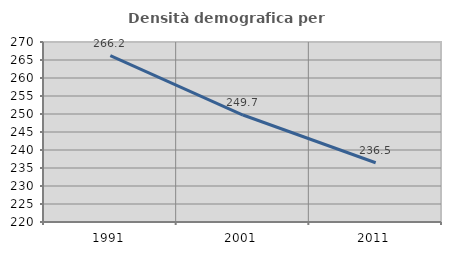
| Category | Densità demografica |
|---|---|
| 1991.0 | 266.185 |
| 2001.0 | 249.72 |
| 2011.0 | 236.456 |